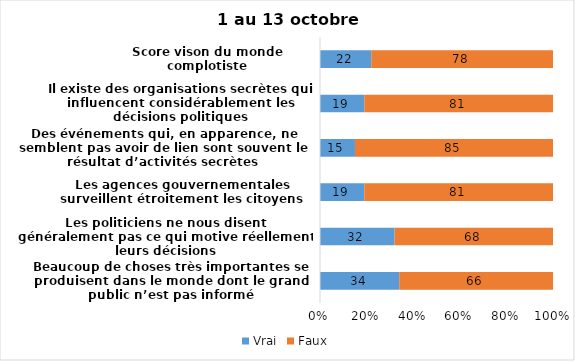
| Category | Vrai | Faux |
|---|---|---|
| Beaucoup de choses très importantes se produisent dans le monde dont le grand public n’est pas informé | 34 | 66 |
| Les politiciens ne nous disent généralement pas ce qui motive réellement leurs décisions | 32 | 68 |
| Les agences gouvernementales surveillent étroitement les citoyens | 19 | 81 |
| Des événements qui, en apparence, ne semblent pas avoir de lien sont souvent le résultat d’activités secrètes | 15 | 85 |
| Il existe des organisations secrètes qui influencent considérablement les décisions politiques | 19 | 81 |
| Score vison du monde complotiste | 22 | 78 |